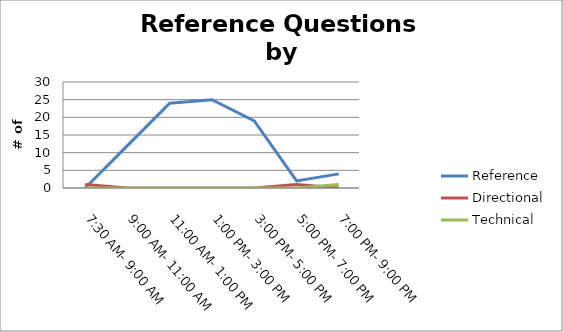
| Category | Reference | Directional | Technical |
|---|---|---|---|
| 7:30 AM- 9:00 AM | 0 | 1 | 0 |
| 9:00 AM- 11:00 AM | 12 | 0 | 0 |
| 11:00 AM- 1:00 PM | 24 | 0 | 0 |
| 1:00 PM- 3:00 PM | 25 | 0 | 0 |
| 3:00 PM- 5:00 PM | 19 | 0 | 0 |
| 5:00 PM- 7:00 PM | 2 | 1 | 0 |
| 7:00 PM- 9:00 PM | 4 | 0 | 1 |